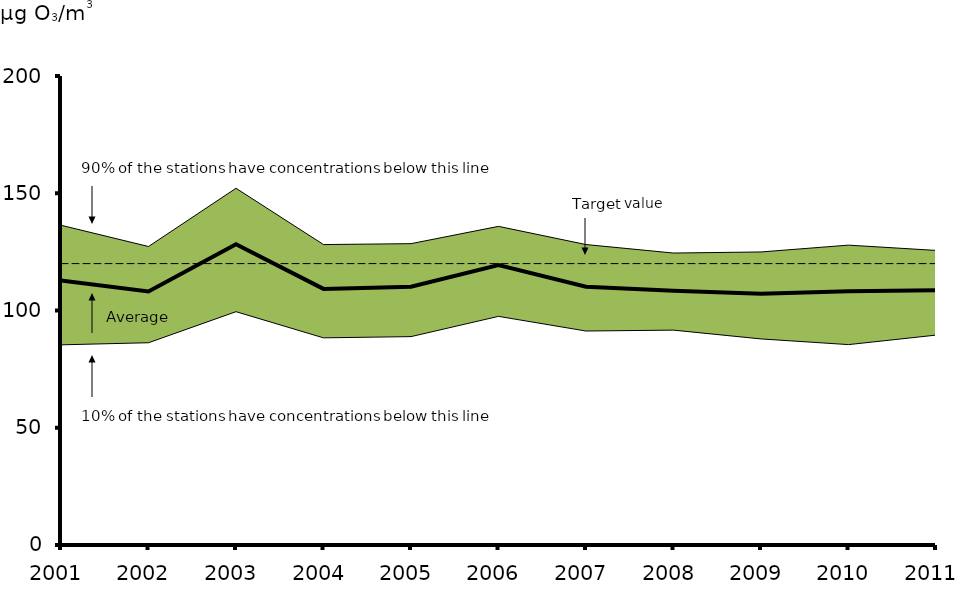
| Category | Average | Target value |
|---|---|---|
| 2001.0 | 112.828 | 120 |
| 2002.0 | 108.099 | 120 |
| 2003.0 | 128.278 | 120 |
| 2004.0 | 109.219 | 120 |
| 2005.0 | 110.165 | 120 |
| 2006.0 | 119.338 | 120 |
| 2007.0 | 110.16 | 120 |
| 2008.0 | 108.376 | 120 |
| 2009.0 | 107.157 | 120 |
| 2010.0 | 108.259 | 120 |
| 2011.0 | 108.654 | 120 |